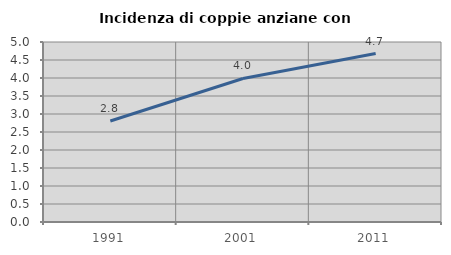
| Category | Incidenza di coppie anziane con figli |
|---|---|
| 1991.0 | 2.805 |
| 2001.0 | 3.987 |
| 2011.0 | 4.678 |